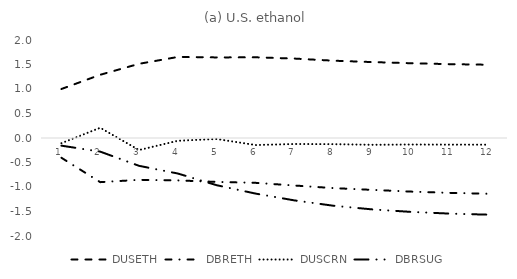
| Category | DUSETH | DBRETH | DUSCRN | DBRSUG |
|---|---|---|---|---|
| 0 | 1 | -0.404 | -0.106 | -0.156 |
| 1 | 1.29 | -0.901 | 0.208 | -0.278 |
| 2 | 1.514 | -0.854 | -0.246 | -0.568 |
| 3 | 1.654 | -0.865 | -0.056 | -0.725 |
| 4 | 1.645 | -0.896 | -0.02 | -0.964 |
| 5 | 1.647 | -0.915 | -0.144 | -1.134 |
| 6 | 1.621 | -0.969 | -0.123 | -1.273 |
| 7 | 1.578 | -1.022 | -0.126 | -1.382 |
| 8 | 1.55 | -1.059 | -0.139 | -1.457 |
| 9 | 1.526 | -1.094 | -0.133 | -1.508 |
| 10 | 1.507 | -1.12 | -0.136 | -1.543 |
| 11 | 1.495 | -1.138 | -0.137 | -1.565 |